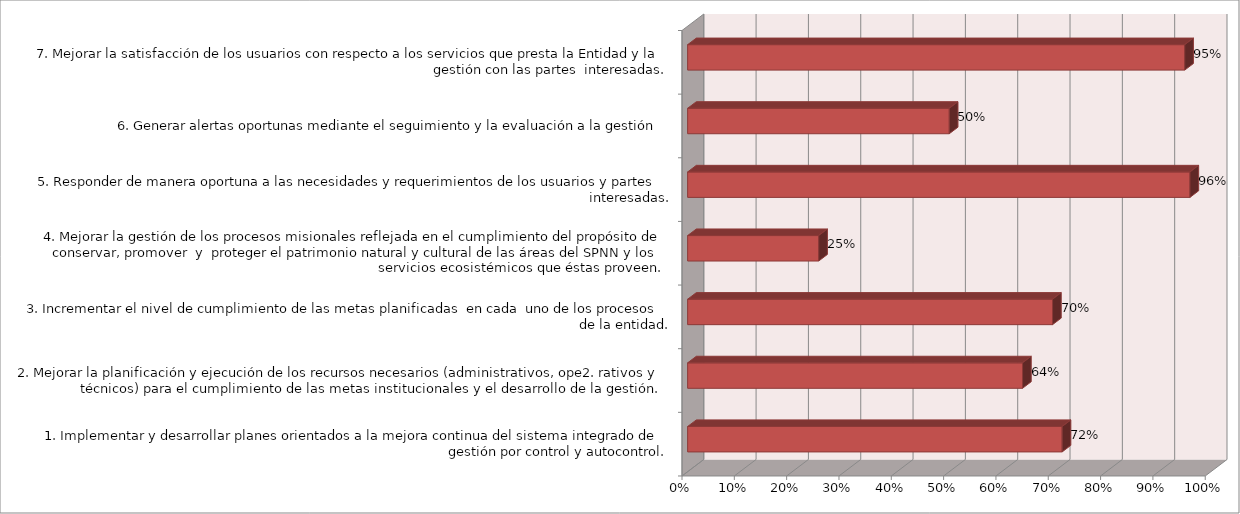
| Category | Series 0 |
|---|---|
| 1. Implementar y desarrollar planes orientados a la mejora continua del sistema integrado de gestión por control y autocontrol. | 0.716 |
| 2. Mejorar la planificación y ejecución de los recursos necesarios (administrativos, ope2. rativos y técnicos) para el cumplimiento de las metas institucionales y el desarrollo de la gestión. | 0.64 |
| 3. Incrementar el nivel de cumplimiento de las metas planificadas  en cada  uno de los procesos de la entidad. | 0.697 |
| 4. Mejorar la gestión de los procesos misionales reflejada en el cumplimiento del propósito de conservar, promover  y  proteger el patrimonio natural y cultural de las áreas del SPNN y los servicios ecosistémicos que éstas proveen.  | 0.25 |
| 5. Responder de manera oportuna a las necesidades y requerimientos de los usuarios y partes interesadas. | 0.96 |
| 6. Generar alertas oportunas mediante el seguimiento y la evaluación a la gestión | 0.5 |
| 7. Mejorar la satisfacción de los usuarios con respecto a los servicios que presta la Entidad y la gestión con las partes  interesadas. | 0.95 |